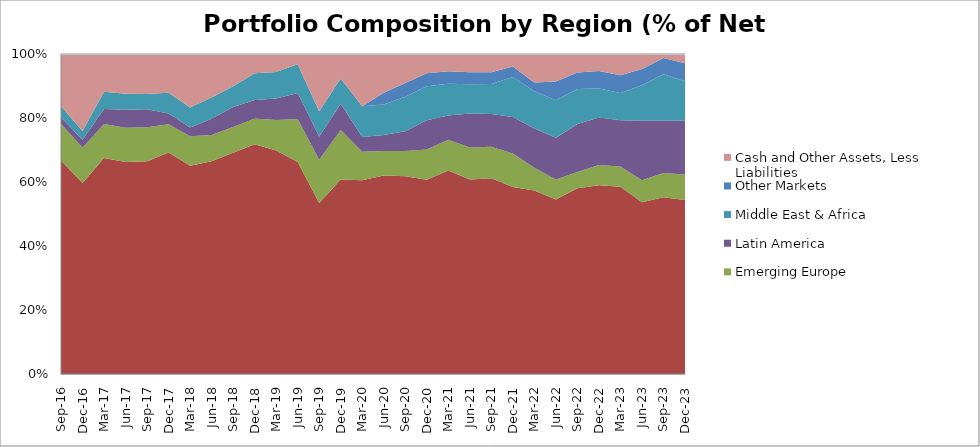
| Category | East & South Asia | Emerging Europe | Latin America | Middle East & Africa | Other Markets | Cash and Other Assets, Less Liabilities |
|---|---|---|---|---|---|---|
| 2016-09-30 | 66.7 | 11.47 | 2.07 | 3.42 | 0 | 16.34 |
| 2016-12-31 | 59.7 | 11 | 2.48 | 2.73 | 0 | 24.09 |
| 2017-03-31 | 67.518 | 10.56 | 4.71 | 5.41 | 0 | 11.79 |
| 2017-06-30 | 66.246 | 10.673 | 5.678 | 4.968 | 0 | 12.434 |
| 2017-09-30 | 66.52 | 10.57 | 5.61 | 4.79 | 0 | 12.51 |
| 2017-12-31 | 69.25 | 8.8 | 3.37 | 6.45 | 0 | 12.13 |
| 2018-03-31 | 65.11 | 9.2 | 2.7 | 6.24 | 0 | 16.75 |
| 2018-06-30 | 66.514 | 8.2 | 5.02 | 6.67 | 0 | 13.6 |
| 2018-09-30 | 69.11 | 8.08 | 6.23 | 6.5 | 0 | 10.08 |
| 2018-12-31 | 71.79 | 8.08 | 5.77 | 8.32 | 0 | 6.04 |
| 2019-03-31 | 69.87 | 9.48 | 6.75 | 8.3 | 0 | 5.6 |
| 2019-06-30 | 66.23 | 13.44 | 8.17 | 8.98 | 0 | 3.18 |
| 2019-09-30 | 53.42 | 13.5 | 7.31 | 7.9 | 0 | 17.87 |
| 2019-12-31 | 60.82 | 15.45 | 8.19 | 7.86 | 0 | 7.68 |
| 2020-03-31 | 60.53 | 8.91 | 4.65 | 9.59 | 0 | 16.32 |
| 2020-06-30 | 62.05 | 7.67 | 4.96 | 9.5 | 3.73 | 12.09 |
| 2020-09-30 | 61.78 | 7.93 | 6.13 | 10.77 | 4.34 | 9.05 |
| 2020-12-31 | 60.68 | 9.47 | 9.12 | 10.67 | 4.02 | 6.04 |
| 2021-03-31 | 63.57 | 9.6 | 7.65 | 9.9 | 3.91 | 5.37 |
| 2021-06-30 | 60.77 | 10.03 | 10.6 | 9.13 | 3.8 | 5.67 |
| 2021-09-30 | 61.15 | 9.83 | 10.28 | 9.38 | 3.68 | 5.68 |
| 2021-12-31 | 58.47 | 10.46 | 11.35 | 12.56 | 3.29 | 3.87 |
| 2022-03-31 | 57.32 | 7.16 | 12.26 | 11.59 | 2.75 | 8.92 |
| 2022-06-30 | 54.57 | 6.18 | 13.09 | 11.72 | 5.88 | 8.56 |
| 2022-09-30 | 58.08 | 5.01 | 15.01 | 10.99 | 5.1 | 5.81 |
| 2022-12-31 | 58.97 | 6.36 | 14.83 | 9.04 | 5.45 | 5.35 |
| 2023-03-31 | 58.53 | 6.32 | 14.48 | 8.47 | 5.55 | 6.65 |
| 2023-06-30 | 53.69 | 6.83 | 18.59 | 11.1 | 5.14 | 4.65 |
| 2023-09-30 | 55.23 | 7.6 | 16.32 | 14.52 | 5.09 | 1.24 |
| 2023-12-31 | 54.38 | 7.93 | 16.84 | 12.32 | 5.61 | 2.92 |